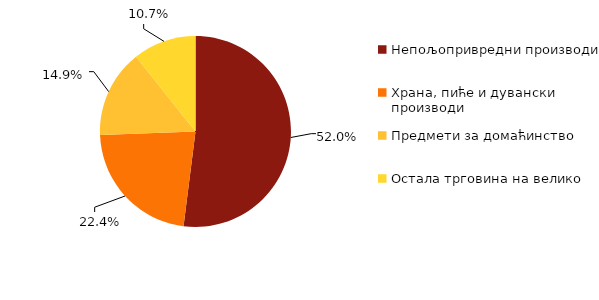
| Category | Учешће у промету |
|---|---|
| Непољопривредни производи  | 52 |
| Храна, пиће и дувански производи | 22.4 |
| Предмети за домаћинство | 14.9 |
| Остала трговина на велико  | 10.7 |